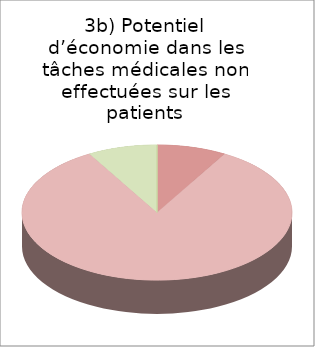
| Category | Tâches médicales non effectuées sur les patients |
|---|---|
| élevé | 2 |
| moyen | 20 |
| faible | 2 |
| aucun | 0 |